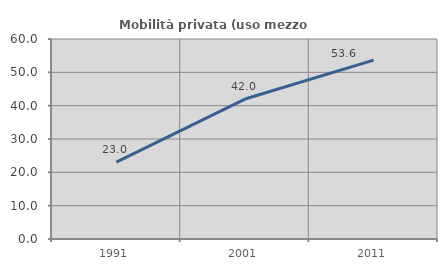
| Category | Mobilità privata (uso mezzo privato) |
|---|---|
| 1991.0 | 23.045 |
| 2001.0 | 41.989 |
| 2011.0 | 53.646 |